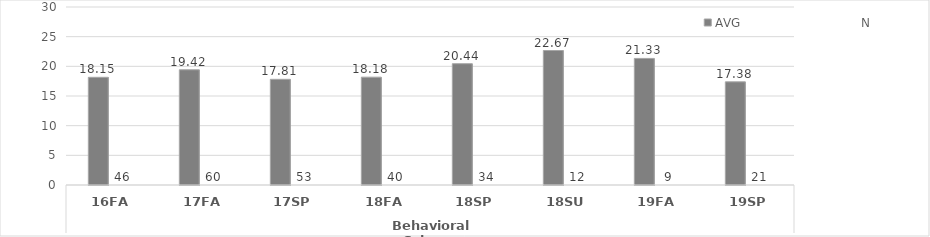
| Category | Intercultural Knowledge and Competence  - AVG | Intercultural Knowledge and Competence  - N |
|---|---|---|
| 0 | 18.152 | 46 |
| 1 | 19.417 | 60 |
| 2 | 17.811 | 53 |
| 3 | 18.175 | 40 |
| 4 | 20.441 | 34 |
| 5 | 22.667 | 12 |
| 6 | 21.333 | 9 |
| 7 | 17.381 | 21 |